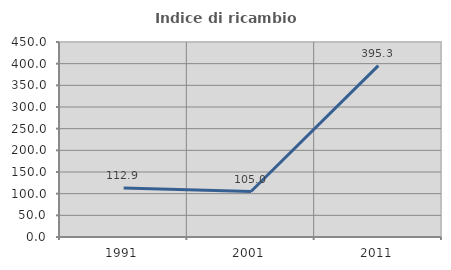
| Category | Indice di ricambio occupazionale  |
|---|---|
| 1991.0 | 112.903 |
| 2001.0 | 105 |
| 2011.0 | 395.349 |